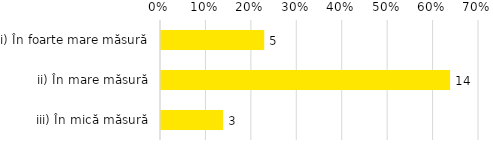
| Category | Total |
|---|---|
| i) În foarte mare măsură | 0.227 |
| ii) În mare măsură | 0.636 |
| iii) În mică măsură | 0.136 |